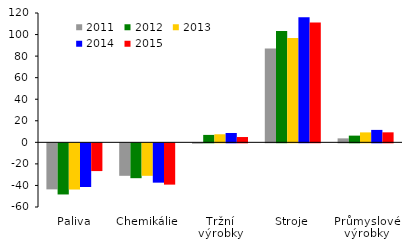
| Category | 2011 | 2012 | 2013 | 2014 | 2015 |
|---|---|---|---|---|---|
| Paliva | -42.717 | -47.438 | -42.866 | -40.544 | -25.74 |
| Chemikálie | -30.132 | -32.337 | -30.148 | -36.481 | -38.312 |
| Tržní výrobky | -0.348 | 6.895 | 7.489 | 8.67 | 4.917 |
| Stroje | 86.957 | 103.345 | 96.733 | 116.106 | 111.182 |
| Průmyslové výrobky | 3.679 | 6.22 | 9.229 | 11.537 | 9.28 |